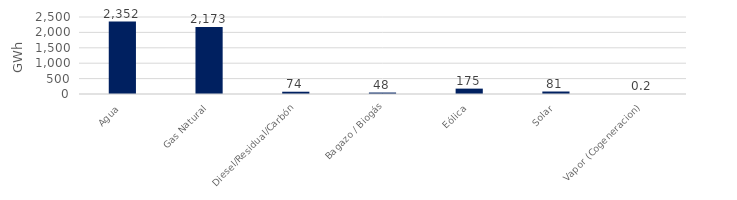
| Category | Series 0 |
|---|---|
| Agua | 2351.818 |
| Gas Natural | 2172.686 |
| Diesel/Residual/Carbón | 73.723 |
| Bagazo / Biogás | 47.626 |
| Eólica | 174.55 |
| Solar | 80.833 |
| Vapor (Cogeneracion) | 0.25 |